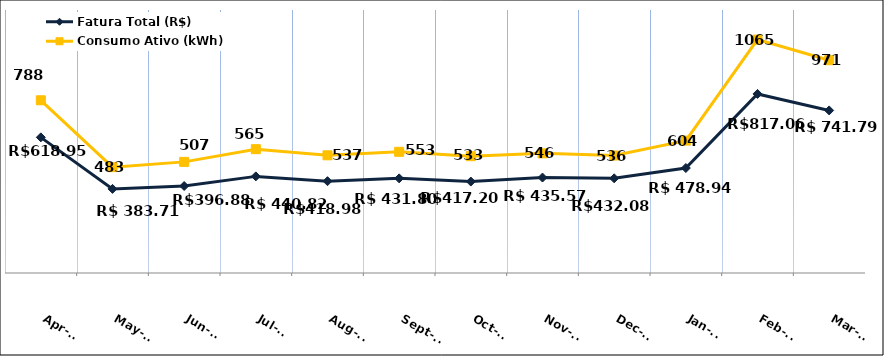
| Category | Fatura Total (R$) |
|---|---|
| 2023-04-01 | 618.95 |
| 2023-05-01 | 383.71 |
| 2023-06-01 | 396.88 |
| 2023-07-01 | 440.82 |
| 2023-08-01 | 418.98 |
| 2023-09-01 | 431.8 |
| 2023-10-01 | 417.2 |
| 2023-11-01 | 435.57 |
| 2023-12-01 | 432.08 |
| 2024-01-01 | 478.94 |
| 2024-02-01 | 817.06 |
| 2024-03-01 | 741.79 |